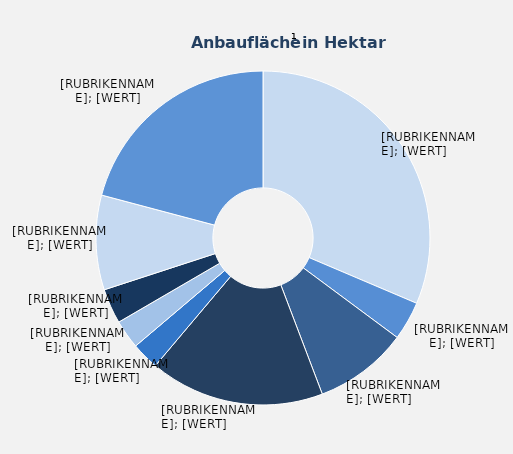
| Category | Series 1 |
|---|---|
| Elstar | 457.5 |
| Jonagold | 0 |
| Jonagored | 54.8 |
| Braeburn | 132.1 |
| Jonaprince | 246.7 |
| Boskoop | 38.7 |
| Holsteiner Cox | 40.7 |
| Topaz | 49.3 |
| Wellant | 133.4 |
| Sonstige | 304 |